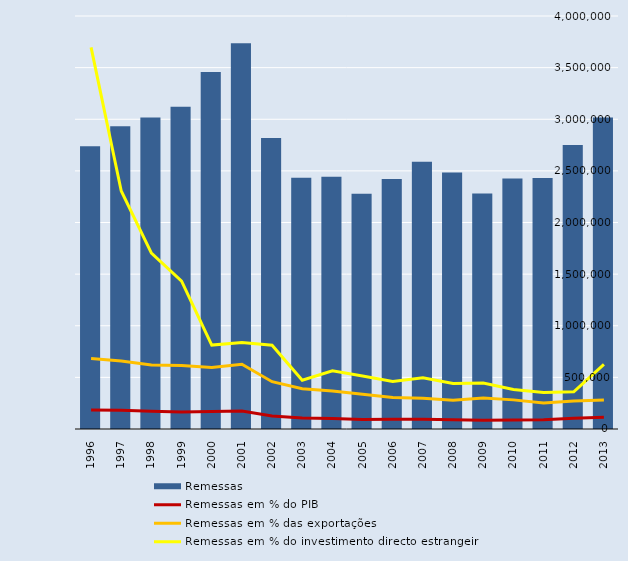
| Category | Remessas |
|---|---|
| 1996.0 | 2737486 |
| 1997.0 | 2932554 |
| 1998.0 | 3016292 |
| 1999.0 | 3121683 |
| 2000.0 | 3458121 |
| 2001.0 | 3736820 |
| 2002.0 | 2817885 |
| 2003.0 | 2433777 |
| 2004.0 | 2442164 |
| 2005.0 | 2277248 |
| 2006.0 | 2420267 |
| 2007.0 | 2588417 |
| 2008.0 | 2484680 |
| 2009.0 | 2281866 |
| 2010.0 | 2425899 |
| 2011.0 | 2430491 |
| 2012.0 | 2749461 |
| 2013.0 | 3015777 |